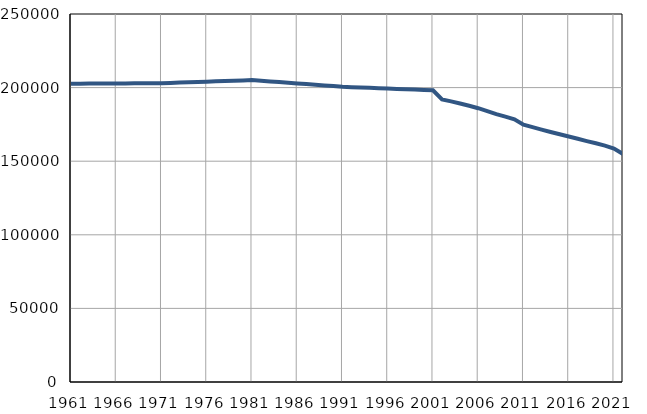
| Category | Број
становника |
|---|---|
| 1961.0 | 202630 |
| 1962.0 | 202666 |
| 1963.0 | 202702 |
| 1964.0 | 202738 |
| 1965.0 | 202774 |
| 1966.0 | 202810 |
| 1967.0 | 202846 |
| 1968.0 | 202882 |
| 1969.0 | 202918 |
| 1970.0 | 202954 |
| 1971.0 | 202990 |
| 1972.0 | 203200 |
| 1973.0 | 203411 |
| 1974.0 | 203621 |
| 1975.0 | 203832 |
| 1976.0 | 204042 |
| 1977.0 | 204252 |
| 1978.0 | 204463 |
| 1979.0 | 204673 |
| 1980.0 | 204884 |
| 1981.0 | 205094 |
| 1982.0 | 204641 |
| 1983.0 | 204187 |
| 1984.0 | 203734 |
| 1985.0 | 203280 |
| 1986.0 | 202827 |
| 1987.0 | 202374 |
| 1988.0 | 201920 |
| 1989.0 | 201467 |
| 1990.0 | 201013 |
| 1991.0 | 200560 |
| 1992.0 | 200320 |
| 1993.0 | 200081 |
| 1994.0 | 199841 |
| 1995.0 | 199602 |
| 1996.0 | 199362 |
| 1997.0 | 199123 |
| 1998.0 | 198883 |
| 1999.0 | 198644 |
| 2000.0 | 198404 |
| 2001.0 | 198165 |
| 2002.0 | 191996 |
| 2003.0 | 190645 |
| 2004.0 | 189156 |
| 2005.0 | 187629 |
| 2006.0 | 186007 |
| 2007.0 | 184014 |
| 2008.0 | 182015 |
| 2009.0 | 180293 |
| 2010.0 | 178464 |
| 2011.0 | 174760 |
| 2012.0 | 173108 |
| 2013.0 | 171466 |
| 2014.0 | 169862 |
| 2015.0 | 168290 |
| 2016.0 | 166795 |
| 2017.0 | 165273 |
| 2018.0 | 163657 |
| 2019.0 | 162165 |
| 2020.0 | 160558 |
| 2021.0 | 158579 |
| 2022.0 | 154890 |